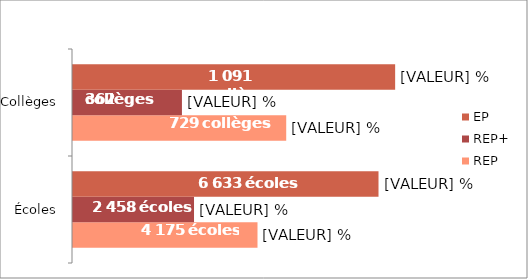
| Category | REP | REP+ | EP |
|---|---|---|---|
| Écoles | 12.3 | 8.067 | 20.367 |
| Collèges | 14.214 | 7.262 | 21.476 |